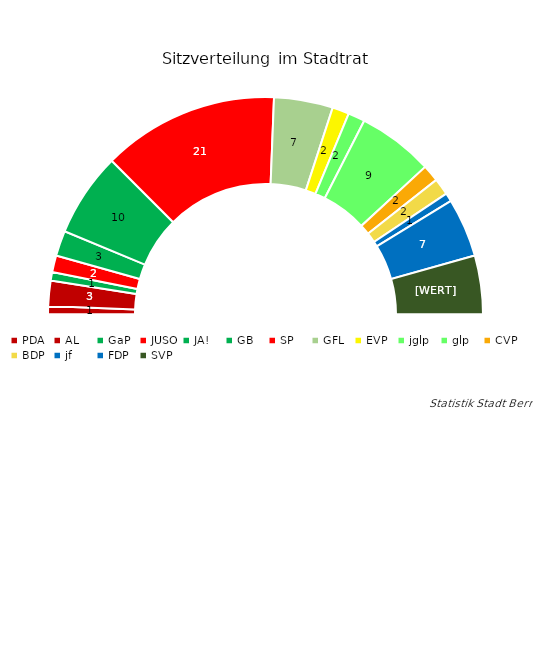
| Category | Sitzverteilung |
|---|---|
| PDA | 1 |
| AL | 3 |
| GaP | 1 |
| JUSO | 2 |
| JA! | 3 |
| GB | 10 |
| SP | 21 |
| GFL | 7 |
| EVP | 2 |
| jglp | 2 |
| glp | 9 |
| CVP | 2 |
| BDP | 2 |
| jf | 1 |
| FDP | 7 |
| SVP | 7 |
| Total | 80 |